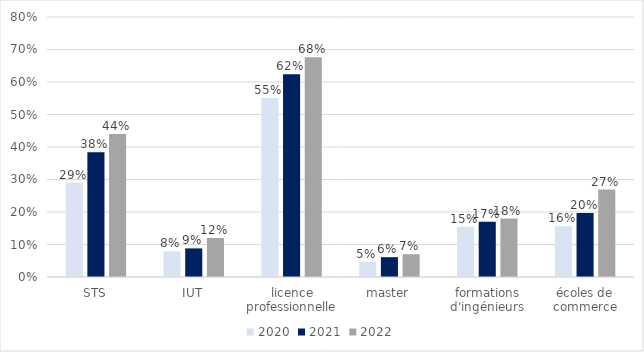
| Category | 2020 | 2021 | 2022 |
|---|---|---|---|
| STS | 0.29 | 0.384 | 0.44 |
| IUT | 0.079 | 0.088 | 0.12 |
| licence professionnelle | 0.55 | 0.624 | 0.676 |
| master | 0.047 | 0.061 | 0.07 |
| formations d'ingénieurs | 0.154 | 0.17 | 0.18 |
| écoles de commerce | 0.156 | 0.197 | 0.269 |